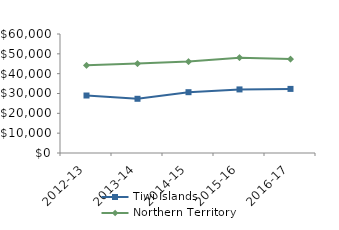
| Category | Tiwi Islands | Northern Territory |
|---|---|---|
| 2012-13 | 28987.89 | 44232.02 |
| 2013-14 | 27337 | 45075.51 |
| 2014-15 | 30661 | 46083.65 |
| 2015-16 | 32056 | 48046.27 |
| 2016-17 | 32316.62 | 47367.05 |